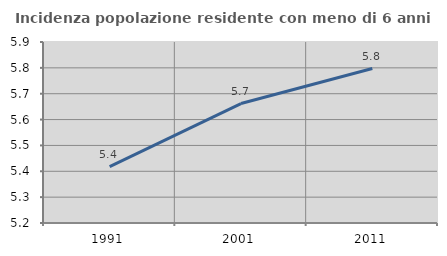
| Category | Incidenza popolazione residente con meno di 6 anni |
|---|---|
| 1991.0 | 5.418 |
| 2001.0 | 5.662 |
| 2011.0 | 5.797 |